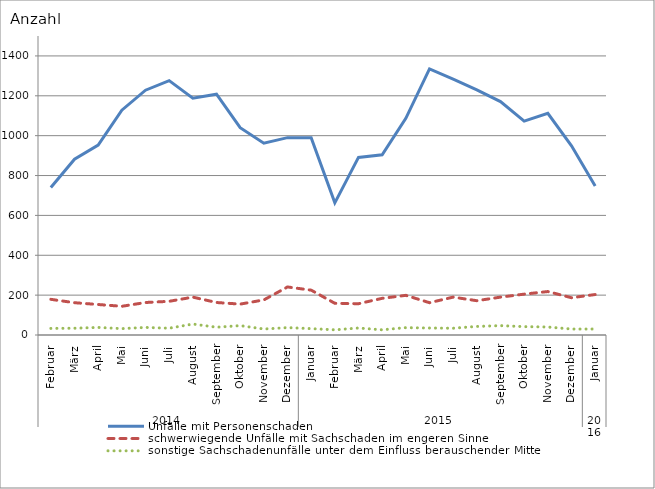
| Category | Unfälle mit Personenschaden | schwerwiegende Unfälle mit Sachschaden im engeren Sinne | sonstige Sachschadenunfälle unter dem Einfluss berauschender Mittel |
|---|---|---|---|
| 0 | 740 | 179 | 33 |
| 1 | 882 | 162 | 34 |
| 2 | 953 | 153 | 38 |
| 3 | 1128 | 144 | 32 |
| 4 | 1228 | 163 | 38 |
| 5 | 1276 | 169 | 34 |
| 6 | 1188 | 190 | 55 |
| 7 | 1208 | 163 | 39 |
| 8 | 1040 | 155 | 47 |
| 9 | 962 | 176 | 30 |
| 10 | 990 | 241 | 37 |
| 11 | 990 | 225 | 32 |
| 12 | 663 | 159 | 26 |
| 13 | 891 | 157 | 35 |
| 14 | 904 | 184 | 26 |
| 15 | 1087 | 199 | 37 |
| 16 | 1335 | 162 | 35 |
| 17 | 1284 | 190 | 34 |
| 18 | 1230 | 172 | 43 |
| 19 | 1171 | 190 | 47 |
| 20 | 1073 | 205 | 42 |
| 21 | 1112 | 218 | 40 |
| 22 | 949 | 187 | 30 |
| 23 | 748 | 203 | 30 |